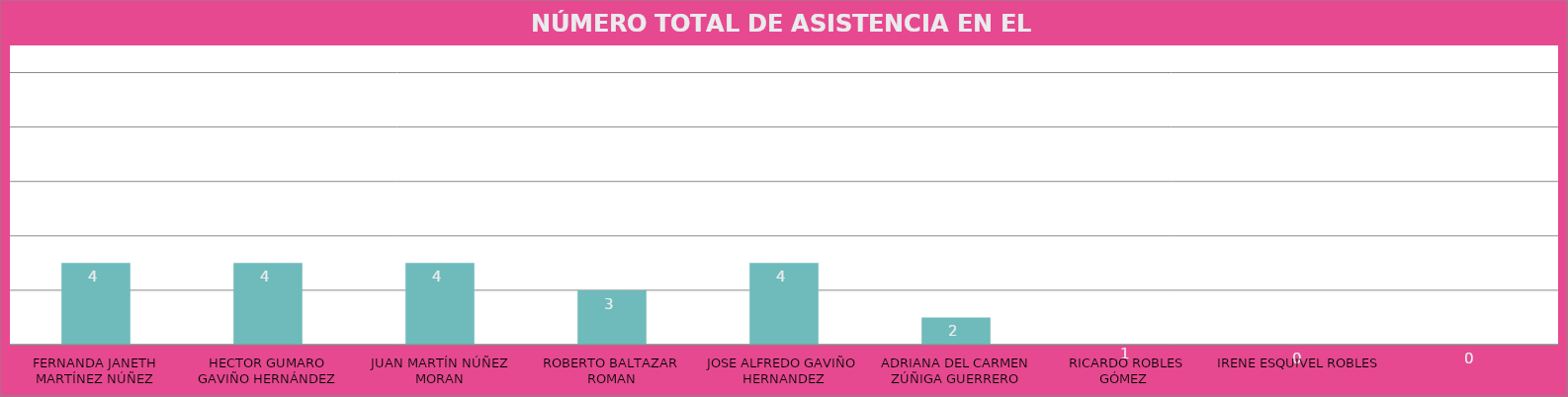
| Category | FERNANDA JANETH MARTÍNEZ NÚÑEZ |
|---|---|
| FERNANDA JANETH MARTÍNEZ NÚÑEZ | 4 |
| HECTOR GUMARO GAVIÑO HERNÁNDEZ | 4 |
| JUAN MARTÍN NÚÑEZ MORAN | 4 |
| ROBERTO BALTAZAR ROMAN | 3 |
| JOSE ALFREDO GAVIÑO HERNANDEZ | 4 |
| ADRIANA DEL CARMEN ZÚÑIGA GUERRERO | 2 |
| RICARDO ROBLES GÓMEZ   | 1 |
| IRENE ESQUIVEL ROBLES  | 0 |